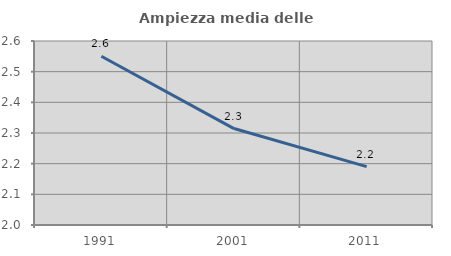
| Category | Ampiezza media delle famiglie |
|---|---|
| 1991.0 | 2.55 |
| 2001.0 | 2.314 |
| 2011.0 | 2.19 |